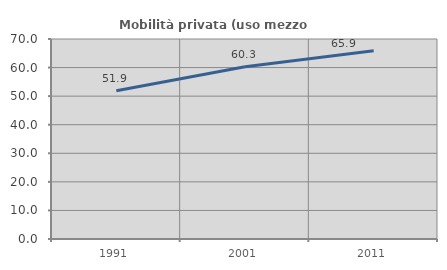
| Category | Mobilità privata (uso mezzo privato) |
|---|---|
| 1991.0 | 51.917 |
| 2001.0 | 60.257 |
| 2011.0 | 65.917 |